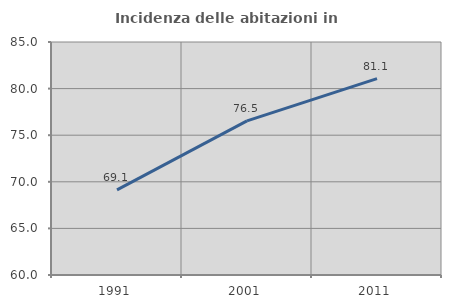
| Category | Incidenza delle abitazioni in proprietà  |
|---|---|
| 1991.0 | 69.129 |
| 2001.0 | 76.533 |
| 2011.0 | 81.063 |